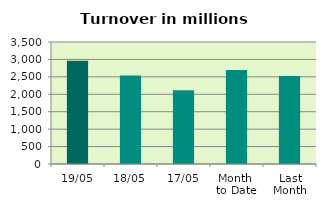
| Category | Series 0 |
|---|---|
| 19/05 | 2964.301 |
| 18/05 | 2540.735 |
| 17/05 | 2115.515 |
| Month 
to Date | 2693.72 |
| Last
Month | 2525.558 |